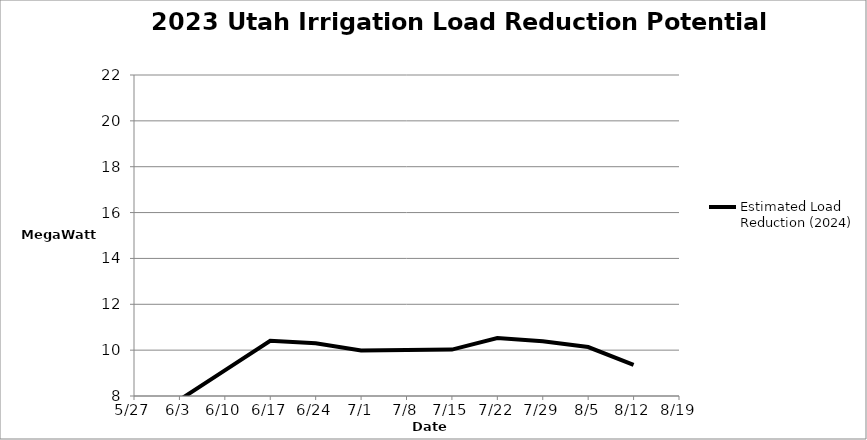
| Category | Estimated Load Reduction (2024) |
|---|---|
| 43245.0 | 7.577 |
| 43254.0 | 7.828 |
| 43261.0 | 9.121 |
| 43268.0 | 10.407 |
| 43275.0 | 10.301 |
| 43282.0 | 9.983 |
| 43289.0 | 10.007 |
| 43296.0 | 10.024 |
| 43303.0 | 10.53 |
| 43310.0 | 10.387 |
| 43317.0 | 10.134 |
| 43324.0 | 9.355 |